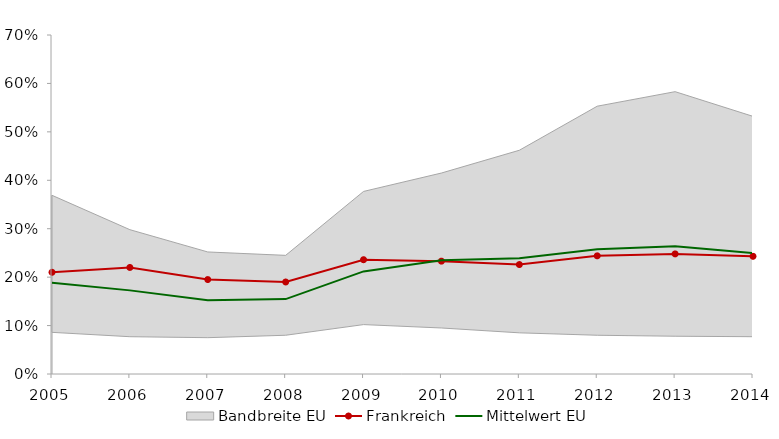
| Category | Frankreich | Mittelwert EU |
|---|---|---|
| 2005 | 0.21 | 0.189 |
| 2006 | 0.22 | 0.173 |
| 2007 | 0.195 | 0.152 |
| 2008 | 0.19 | 0.155 |
| 2009 | 0.236 | 0.212 |
| 2010 | 0.233 | 0.235 |
| 2011 | 0.226 | 0.239 |
| 2012 | 0.244 | 0.257 |
| 2013 | 0.248 | 0.264 |
| 2014 | 0.243 | 0.25 |